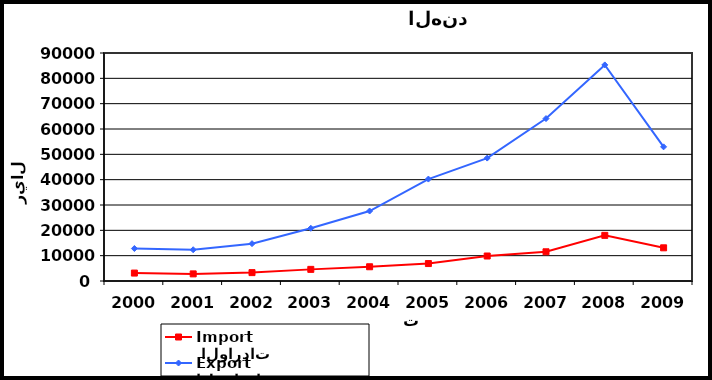
| Category |  الواردات           Import | الصادرات          Export |
|---|---|---|
| 2000.0 | 3132 | 12823 |
| 2001.0 | 2811 | 12336 |
| 2002.0 | 3307 | 14742 |
| 2003.0 | 4589 | 20804 |
| 2004.0 | 5622 | 27625 |
| 2005.0 | 6884 | 40237 |
| 2006.0 | 9864 | 48520 |
| 2007.0 | 11529 | 64120 |
| 2008.0 | 18012 | 85295 |
| 2009.0 | 13095 | 52951 |